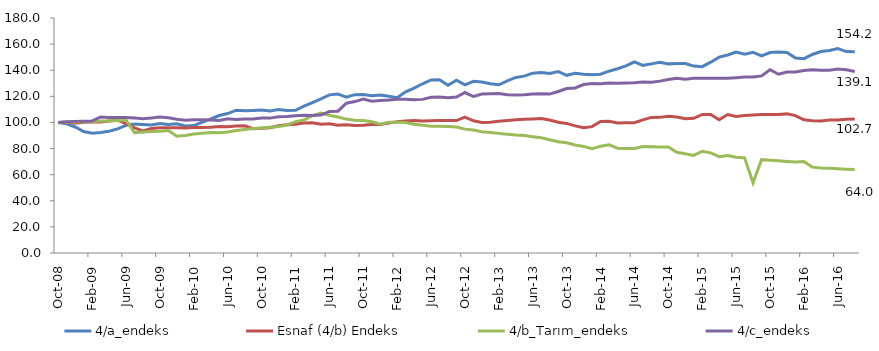
| Category | 4/a_endeks | Esnaf (4/b) Endeks | 4/b_Tarım_endeks | 4/c_endeks |
|---|---|---|---|---|
| 2008-10-01 | 100 | 100 | 100 | 100 |
| 2008-11-01 | 98.935 | 100.067 | 100.274 | 100.533 |
| 2008-12-01 | 96.525 | 99.345 | 100.357 | 100.818 |
| 2009-01-01 | 92.994 | 100.101 | 100.587 | 100.97 |
| 2009-02-01 | 91.692 | 100.433 | 100.811 | 101.174 |
| 2009-03-01 | 92.218 | 100.295 | 101.133 | 104.171 |
| 2009-04-01 | 93.236 | 101.106 | 101.067 | 103.846 |
| 2009-05-01 | 95.118 | 101.83 | 101.43 | 103.771 |
| 2009-06-01 | 97.838 | 99.179 | 101.86 | 103.826 |
| 2009-07-01 | 98.831 | 95.812 | 92.229 | 103.33 |
| 2009-08-01 | 98.44 | 93.49 | 92.613 | 102.755 |
| 2009-09-01 | 98.139 | 95.317 | 93.123 | 103.427 |
| 2009-10-01 | 99.198 | 95.863 | 93.339 | 104.188 |
| 2009-11-01 | 98.422 | 96.001 | 93.78 | 103.588 |
| 2009-12-01 | 99.016 | 95.904 | 89.387 | 102.452 |
| 2010-01-01 | 97.314 | 95.764 | 90 | 101.69 |
| 2010-02-01 | 97.59 | 96.123 | 91.107 | 102.04 |
| 2010-03-01 | 100.177 | 96.134 | 91.79 | 102.098 |
| 2010-04-01 | 102.651 | 96.362 | 92.251 | 101.869 |
| 2010-05-01 | 105.314 | 96.863 | 92.097 | 101.479 |
| 2010-06-01 | 106.833 | 96.794 | 92.748 | 102.853 |
| 2010-07-01 | 109.396 | 97.354 | 93.907 | 102.336 |
| 2010-08-01 | 108.969 | 97.428 | 94.582 | 102.595 |
| 2010-09-01 | 109.208 | 95.149 | 95.298 | 102.686 |
| 2010-10-01 | 109.569 | 95.493 | 95.792 | 103.459 |
| 2010-11-01 | 108.717 | 95.921 | 96.328 | 103.315 |
| 2010-12-01 | 109.988 | 97.478 | 96.811 | 104.33 |
| 2011-01-01 | 109.221 | 98.229 | 98.033 | 104.558 |
| 2011-02-01 | 109.321 | 98.588 | 100.612 | 105.196 |
| 2011-03-01 | 112.413 | 99.516 | 101.801 | 105.426 |
| 2011-04-01 | 115.262 | 99.786 | 105.131 | 105.398 |
| 2011-05-01 | 118.106 | 98.674 | 107.104 | 105.683 |
| 2011-06-01 | 121.118 | 98.914 | 105.476 | 108.355 |
| 2011-07-01 | 121.848 | 97.803 | 104.171 | 108.628 |
| 2011-08-01 | 119.374 | 98.244 | 102.575 | 114.705 |
| 2011-09-01 | 121.29 | 97.613 | 101.631 | 115.992 |
| 2011-10-01 | 121.471 | 97.839 | 101.466 | 117.899 |
| 2011-11-01 | 120.442 | 98.353 | 100.461 | 116.266 |
| 2011-12-01 | 120.954 | 98.449 | 98.626 | 116.749 |
| 2012-01-01 | 120.146 | 99.482 | 100.185 | 117.162 |
| 2012-02-01 | 118.92 | 100.562 | 100.104 | 117.765 |
| 2012-03-01 | 123.437 | 101.136 | 99.885 | 117.683 |
| 2012-04-01 | 126.337 | 101.419 | 98.567 | 117.438 |
| 2012-05-01 | 129.615 | 101.089 | 97.908 | 117.67 |
| 2012-06-01 | 132.535 | 101.329 | 97.098 | 119.337 |
| 2012-07-01 | 132.763 | 101.498 | 97.057 | 119.473 |
| 2012-08-01 | 128.467 | 101.412 | 96.807 | 118.867 |
| 2012-09-01 | 132.337 | 101.441 | 96.462 | 119.458 |
| 2012-10-01 | 128.772 | 104.059 | 94.886 | 122.904 |
| 2012-11-01 | 131.546 | 101.225 | 94.173 | 119.881 |
| 2012-12-01 | 130.918 | 100.007 | 92.918 | 121.704 |
| 2013-01-01 | 129.586 | 100.161 | 92.34 | 121.95 |
| 2013-02-01 | 128.817 | 100.876 | 91.623 | 122.076 |
| 2013-03-01 | 131.918 | 101.456 | 90.988 | 121.189 |
| 2013-04-01 | 134.457 | 102.021 | 90.362 | 121.106 |
| 2013-05-01 | 135.462 | 102.524 | 89.917 | 121.162 |
| 2013-06-01 | 137.734 | 102.699 | 89.012 | 121.736 |
| 2013-07-01 | 138.326 | 102.96 | 88.251 | 121.992 |
| 2013-08-01 | 137.53 | 101.831 | 86.718 | 121.726 |
| 2013-09-01 | 139.029 | 100.141 | 85.282 | 123.736 |
| 2013-10-01 | 136.108 | 99.267 | 84.435 | 126.014 |
| 2013-11-01 | 137.694 | 97.366 | 82.715 | 126.433 |
| 2013-12-01 | 136.888 | 95.922 | 81.629 | 129.054 |
| 2014-01-01 | 136.492 | 96.789 | 79.843 | 129.761 |
| 2014-02-01 | 136.909 | 100.784 | 81.76 | 129.662 |
| 2014-03-01 | 139.257 | 100.965 | 82.863 | 130.252 |
| 2014-04-01 | 141.106 | 99.594 | 80.306 | 130.035 |
| 2014-05-01 | 143.297 | 99.709 | 80.129 | 130.238 |
| 2014-06-01 | 146.399 | 99.798 | 80.126 | 130.365 |
| 2014-07-01 | 143.748 | 101.999 | 81.533 | 130.946 |
| 2014-08-01 | 144.871 | 103.846 | 81.397 | 130.707 |
| 2014-09-01 | 146.071 | 103.888 | 81.14 | 131.638 |
| 2014-10-01 | 144.864 | 104.794 | 81.14 | 132.937 |
| 2014-11-01 | 145.148 | 104.206 | 77.207 | 133.891 |
| 2014-12-01 | 145.178 | 102.763 | 76.004 | 133.019 |
| 2015-01-01 | 143.184 | 103.199 | 74.76 | 133.774 |
| 2015-02-01 | 142.755 | 106.15 | 77.956 | 133.898 |
| 2015-03-01 | 146.143 | 106.043 | 76.683 | 133.768 |
| 2015-04-01 | 150.015 | 102.065 | 73.794 | 133.867 |
| 2015-05-01 | 151.651 | 106.083 | 74.577 | 133.866 |
| 2015-06-01 | 153.878 | 104.504 | 73.283 | 134.239 |
| 2015-07-01 | 152.318 | 105.228 | 72.88 | 134.75 |
| 2015-08-01 | 153.744 | 105.668 | 53.732 | 134.833 |
| 2015-09-01 | 150.899 | 106.118 | 71.576 | 135.643 |
| 2015-10-01 | 153.562 | 106.061 | 71.049 | 140.372 |
| 2015-11-01 | 153.949 | 106.153 | 70.59 | 136.949 |
| 2015-12-01 | 153.503 | 106.56 | 70.101 | 138.633 |
| 2016-01-01 | 149.352 | 105.273 | 69.686 | 138.685 |
| 2016-02-01 | 148.851 | 102.039 | 70.101 | 139.835 |
| 2016-03-01 | 152.049 | 101.336 | 65.771 | 140.267 |
| 2016-04-01 | 154.276 | 101.116 | 65.075 | 139.961 |
| 2016-05-01 | 155.081 | 101.782 | 64.948 | 140.05 |
| 2016-06-01 | 156.528 | 101.875 | 64.504 | 140.931 |
| 2016-07-01 | 154.25 | 102.447 | 64.181 | 140.404 |
| 2016-08-01 | 154.162 | 102.712 | 63.995 | 139.057 |